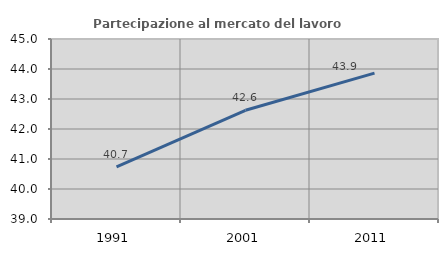
| Category | Partecipazione al mercato del lavoro  femminile |
|---|---|
| 1991.0 | 40.741 |
| 2001.0 | 42.623 |
| 2011.0 | 43.862 |